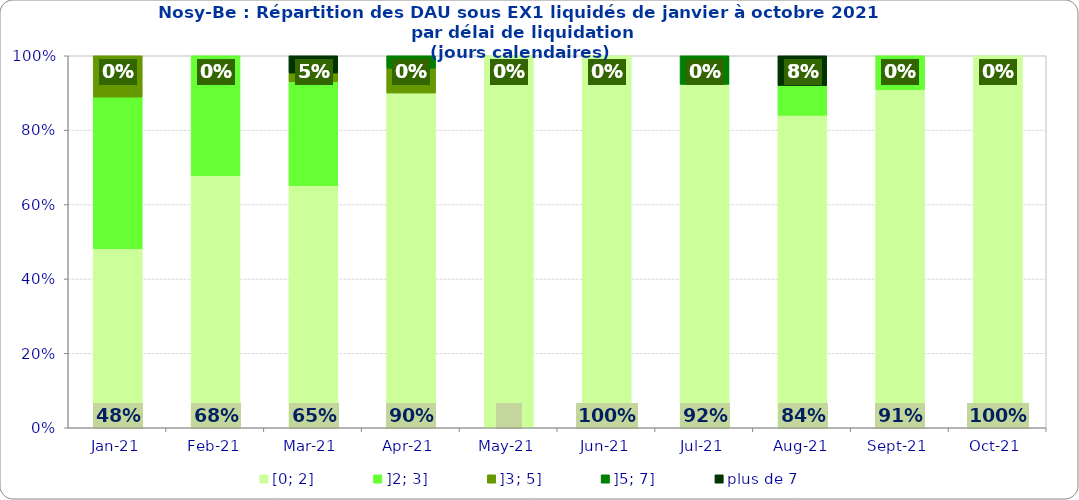
| Category | [0; 2] | ]2; 3] | ]3; 5] | ]5; 7] | plus de 7 |
|---|---|---|---|---|---|
| 2021-01-01 | 0.481 | 0.407 | 0.111 | 0 | 0 |
| 2021-02-01 | 0.677 | 0.323 | 0 | 0 | 0 |
| 2021-03-01 | 0.651 | 0.279 | 0.023 | 0 | 0.047 |
| 2021-04-01 | 0.9 | 0 | 0.067 | 0.033 | 0 |
| 2021-05-01 | 1 | 0 | 0 | 0 | 0 |
| 2021-06-01 | 1 | 0 | 0 | 0 | 0 |
| 2021-07-01 | 0.923 | 0 | 0 | 0.077 | 0 |
| 2021-08-01 | 0.84 | 0.08 | 0 | 0 | 0.08 |
| 2021-09-01 | 0.909 | 0.091 | 0 | 0 | 0 |
| 2021-10-01 | 1 | 0 | 0 | 0 | 0 |